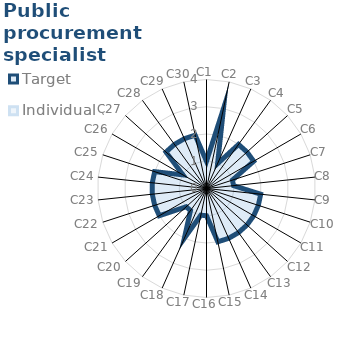
| Category | Target | Individual 3 |
|---|---|---|
| C1 | 1 | 0 |
| C2 | 3 | 0 |
| C3 | 1 | 0 |
| C4 | 2 | 0 |
| C5 | 2 | 0 |
| C6 | 2 | 0 |
| C7 | 1 | 0 |
| C8 | 1 | 0 |
| C9 | 2 | 0 |
| C10 | 2 | 0 |
| C11 | 2 | 0 |
| C12 | 2 | 0 |
| C13 | 2 | 0 |
| C14 | 2 | 0 |
| C15 | 2 | 0 |
| C16 | 1 | 0 |
| C17 | 1 | 0 |
| C18 | 2 | 0 |
| C19 | 1 | 0 |
| C20 | 1 | 0 |
| C21 | 2 | 0 |
| C22 | 2 | 0 |
| C23 | 2 | 0 |
| C24 | 2 | 0 |
| C25 | 2 | 0 |
| C26 | 1 | 0 |
| C27 | 2 | 0 |
| C28 | 2 | 0 |
| C29 | 2 | 0 |
| C30 | 2 | 0 |